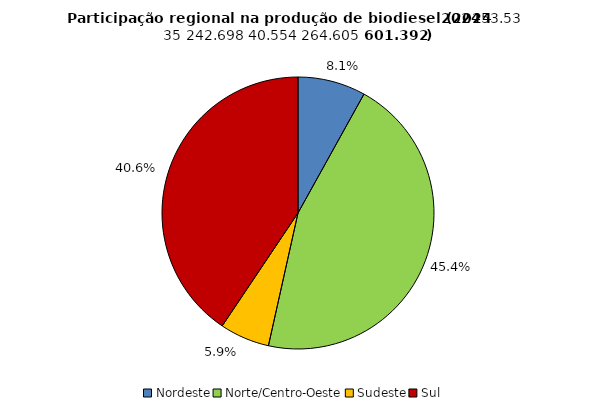
| Category | Series 0 |
|---|---|
| Nordeste | 347625.638 |
| Norte/Centro-Oeste | 1958644.911 |
| Sudeste | 255148.888 |
| Sul | 1750224.291 |